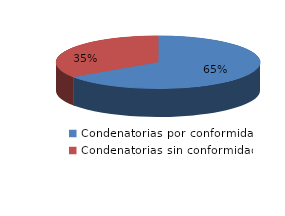
| Category | Series 0 |
|---|---|
| 0 | 74 |
| 1 | 39 |